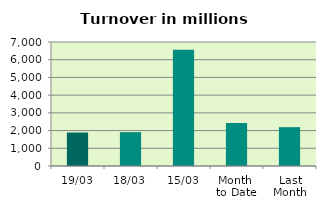
| Category | Series 0 |
|---|---|
| 19/03 | 1888.061 |
| 18/03 | 1912.185 |
| 15/03 | 6563.08 |
| Month 
to Date | 2431.806 |
| Last
Month | 2191.938 |